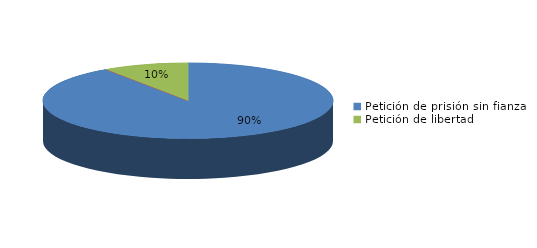
| Category | Series 0 |
|---|---|
| Petición de prisión sin fianza | 57 |
| Peticion de libertad con fianza | 0 |
| Petición de libertad | 6 |